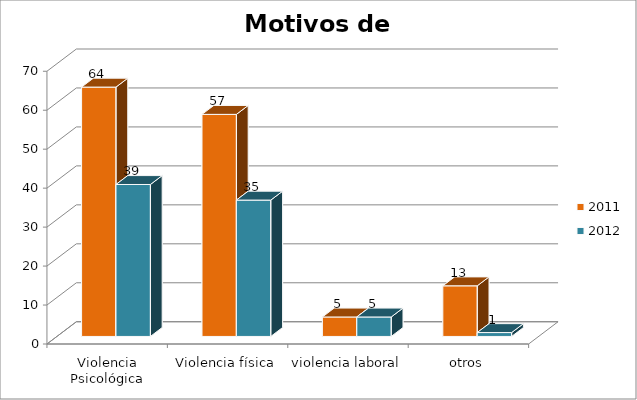
| Category | 2011 | 2012 |
|---|---|---|
| Violencia Psicológica | 64 | 39 |
| Violencia física | 57 | 35 |
| violencia laboral | 5 | 5 |
| otros | 13 | 1 |